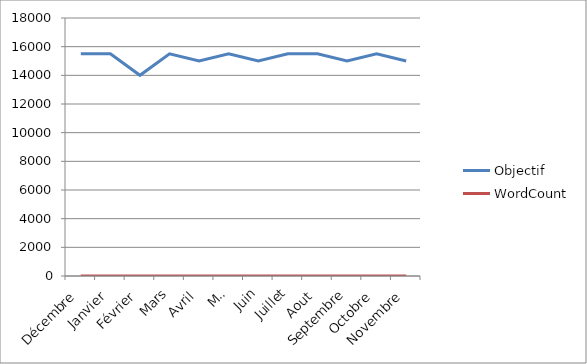
| Category | Objectif | WordCount |
|---|---|---|
| Décembre | 15500 | 0 |
| Janvier | 15500 | 0 |
| Février | 14000 | 0 |
| Mars | 15500 | 0 |
| Avril | 15000 | 0 |
| Mai | 15500 | 0 |
| Juin | 15000 | 0 |
| Juillet | 15500 | 0 |
| Aout | 15500 | 0 |
| Septembre | 15000 | 0 |
| Octobre | 15500 | 0 |
| Novembre | 15000 | 0 |